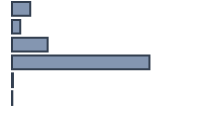
| Category | Series 0 |
|---|---|
| 0 | 9.114 |
| 1 | 4.152 |
| 2 | 17.725 |
| 3 | 68.384 |
| 4 | 0.47 |
| 5 | 0.154 |